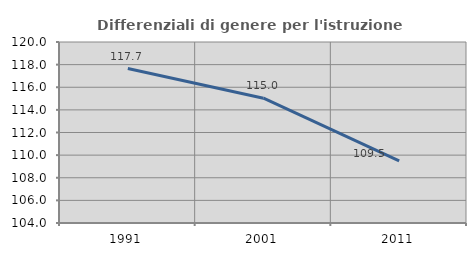
| Category | Differenziali di genere per l'istruzione superiore |
|---|---|
| 1991.0 | 117.654 |
| 2001.0 | 115.035 |
| 2011.0 | 109.496 |